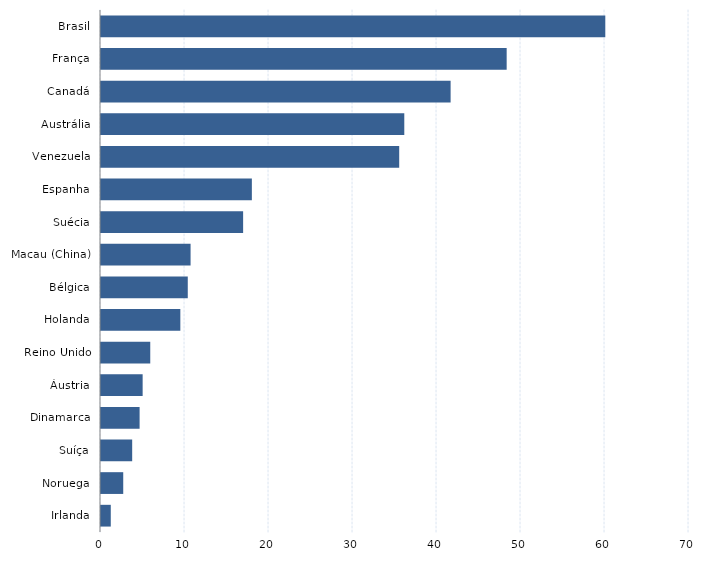
| Category | Series 0 |
|---|---|
| Irlanda | 1.164 |
| Noruega | 2.647 |
| Suíça | 3.713 |
| Dinamarca | 4.595 |
| Áustria | 4.957 |
| Reino Unido | 5.864 |
| Holanda | 9.446 |
| Bélgica | 10.33 |
| Macau (China) | 10.664 |
| Suécia | 16.92 |
| Espanha | 17.96 |
| Venezuela | 35.501 |
| Austrália | 36.107 |
| Canadá | 41.621 |
| França | 48.294 |
| Brasil | 60.035 |